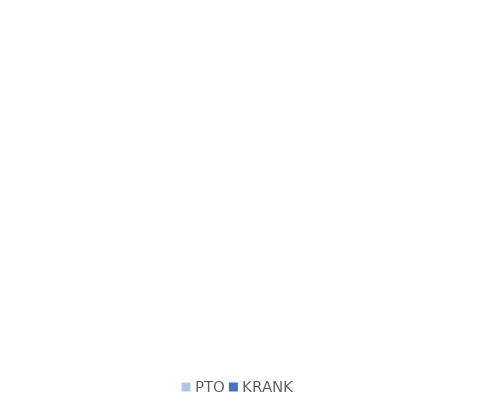
| Category | Series 0 |
|---|---|
| PTO | 0 |
| KRANK | 0 |